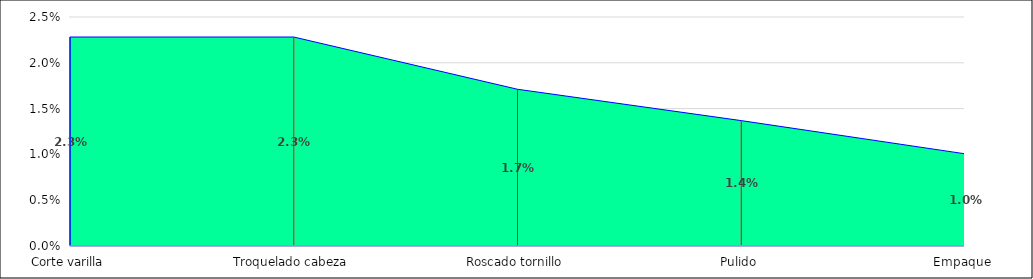
| Category | Series 0 |
|---|---|
| Corte varilla | 0.023 |
| Troquelado cabeza | 0.023 |
| Roscado tornillo | 0.017 |
| Pulido | 0.014 |
| Empaque | 0.01 |